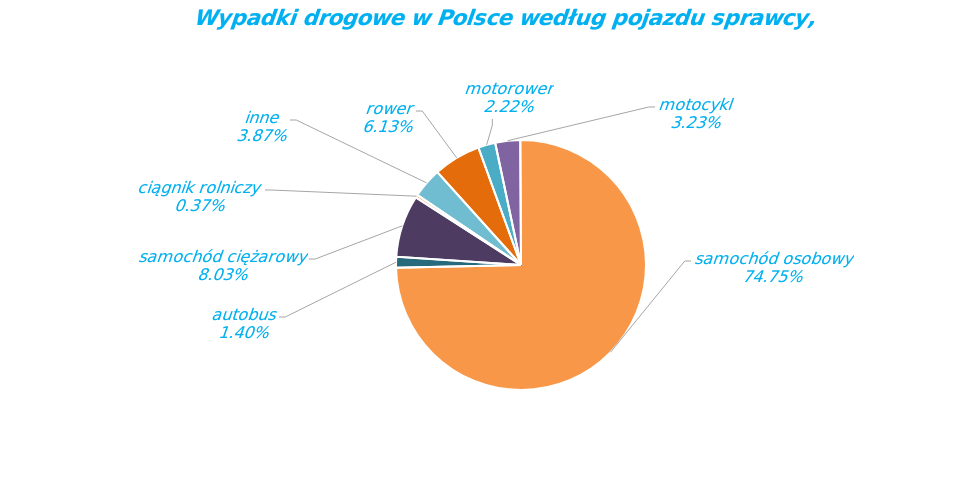
| Category | Series 0 |
|---|---|
| rower | 1626 |
| motorower | 590 |
| motocykl | 856 |
| samochód osobowy | 19833 |
| autobus | 372 |
| samochód ciężarowy | 2131 |
| ciągnik rolniczy | 99 |
| inne | 1027 |